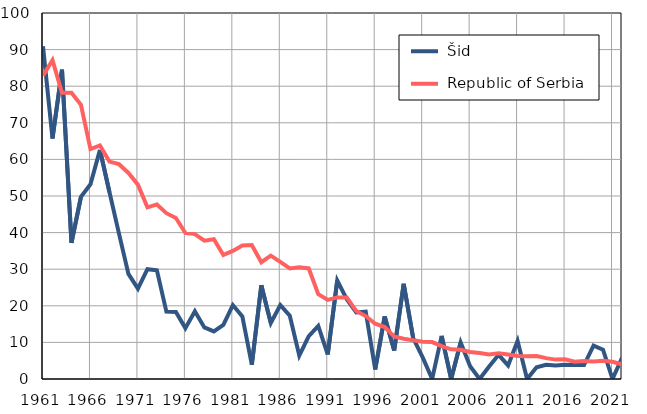
| Category |  Šid |  Republic of Serbia |
|---|---|---|
| 1961.0 | 90.9 | 82.9 |
| 1962.0 | 65.7 | 87.1 |
| 1963.0 | 84.5 | 78.2 |
| 1964.0 | 37.2 | 78.2 |
| 1965.0 | 49.8 | 74.9 |
| 1966.0 | 53.2 | 62.8 |
| 1967.0 | 62.6 | 63.8 |
| 1968.0 | 51.1 | 59.4 |
| 1969.0 | 39.8 | 58.7 |
| 1970.0 | 28.7 | 56.3 |
| 1971.0 | 24.7 | 53.1 |
| 1972.0 | 30 | 46.9 |
| 1973.0 | 29.7 | 47.7 |
| 1974.0 | 18.4 | 45.3 |
| 1975.0 | 18.3 | 44 |
| 1976.0 | 13.9 | 39.9 |
| 1977.0 | 18.5 | 39.6 |
| 1978.0 | 14.1 | 37.8 |
| 1979.0 | 13 | 38.2 |
| 1980.0 | 14.8 | 33.9 |
| 1981.0 | 20.2 | 35 |
| 1982.0 | 17.1 | 36.5 |
| 1983.0 | 3.9 | 36.6 |
| 1984.0 | 25.6 | 31.9 |
| 1985.0 | 15.3 | 33.7 |
| 1986.0 | 20.2 | 32 |
| 1987.0 | 17.3 | 30.2 |
| 1988.0 | 6.4 | 30.5 |
| 1989.0 | 11.7 | 30.2 |
| 1990.0 | 14.5 | 23.2 |
| 1991.0 | 6.7 | 21.6 |
| 1992.0 | 26.9 | 22.3 |
| 1993.0 | 21.8 | 22.3 |
| 1994.0 | 18.2 | 18.6 |
| 1995.0 | 18.4 | 17.2 |
| 1996.0 | 2.6 | 15.1 |
| 1997.0 | 17.1 | 14.2 |
| 1998.0 | 7.8 | 11.6 |
| 1999.0 | 26 | 11 |
| 2000.0 | 11.2 | 10.6 |
| 2001.0 | 5.9 | 10.2 |
| 2002.0 | 0 | 10.1 |
| 2003.0 | 11.8 | 9 |
| 2004.0 | 0 | 8.1 |
| 2005.0 | 10 | 8 |
| 2006.0 | 3.5 | 7.4 |
| 2007.0 | 0 | 7.1 |
| 2008.0 | 3.4 | 6.7 |
| 2009.0 | 6.6 | 7 |
| 2010.0 | 3.7 | 6.7 |
| 2011.0 | 10.4 | 6.3 |
| 2012.0 | 0 | 6.2 |
| 2013.0 | 3.2 | 6.3 |
| 2014.0 | 3.9 | 5.7 |
| 2015.0 | 3.7 | 5.3 |
| 2016.0 | 3.9 | 5.4 |
| 2017.0 | 3.8 | 4.7 |
| 2018.0 | 3.8 | 4.9 |
| 2019.0 | 9.1 | 4.8 |
| 2020.0 | 8 | 5 |
| 2021.0 | 0 | 4.7 |
| 2022.0 | 5.8 | 4 |